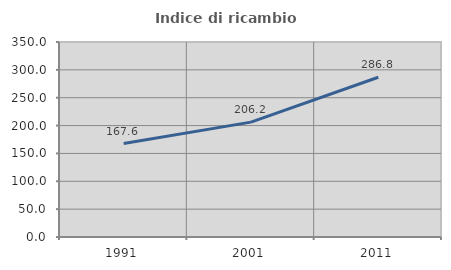
| Category | Indice di ricambio occupazionale  |
|---|---|
| 1991.0 | 167.647 |
| 2001.0 | 206.215 |
| 2011.0 | 286.765 |